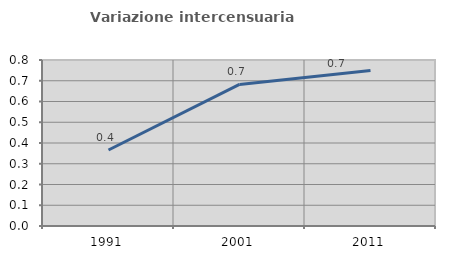
| Category | Variazione intercensuaria annua |
|---|---|
| 1991.0 | 0.366 |
| 2001.0 | 0.682 |
| 2011.0 | 0.75 |